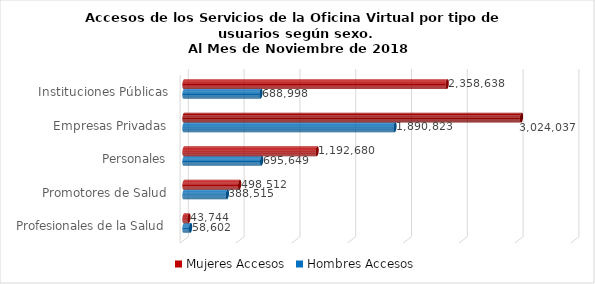
| Category | Mujeres | Hombres |
|---|---|---|
| Instituciones Públicas | 2358638 | 688998 |
| Empresas Privadas | 3024037 | 1890823 |
| Personales | 1192680 | 695649 |
| Promotores de Salud | 498512 | 388515 |
| Profesionales de la Salud | 43744 | 58602 |